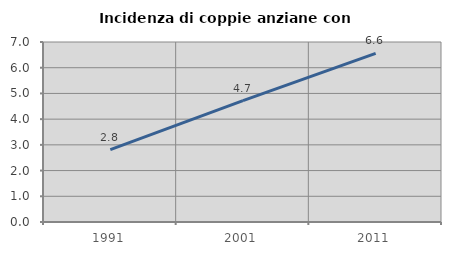
| Category | Incidenza di coppie anziane con figli |
|---|---|
| 1991.0 | 2.814 |
| 2001.0 | 4.723 |
| 2011.0 | 6.557 |